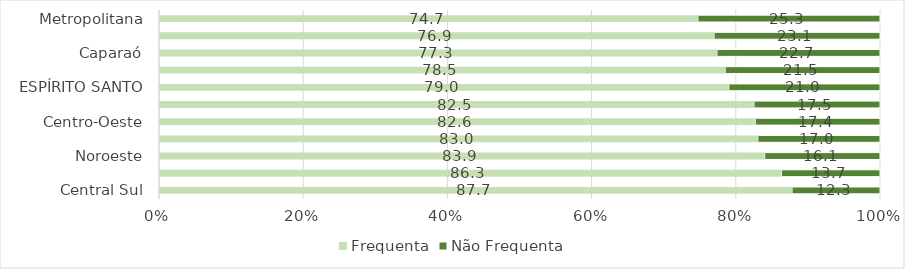
| Category | Frequenta | Não Frequenta |
|---|---|---|
| Central Sul | 87.728 | 12.272 |
| Nordeste | 86.253 | 13.747 |
| Noroeste | 83.943 | 16.057 |
| Litoral Sul | 82.989 | 17.011 |
| Centro-Oeste | 82.632 | 17.368 |
| Central Serrana | 82.459 | 17.541 |
| ESPÍRITO SANTO | 78.966 | 21.034 |
| Sudoeste Serrana | 78.456 | 21.544 |
| Caparaó | 77.317 | 22.683 |
| Rio Doce | 76.917 | 23.083 |
| Metropolitana | 74.676 | 25.324 |